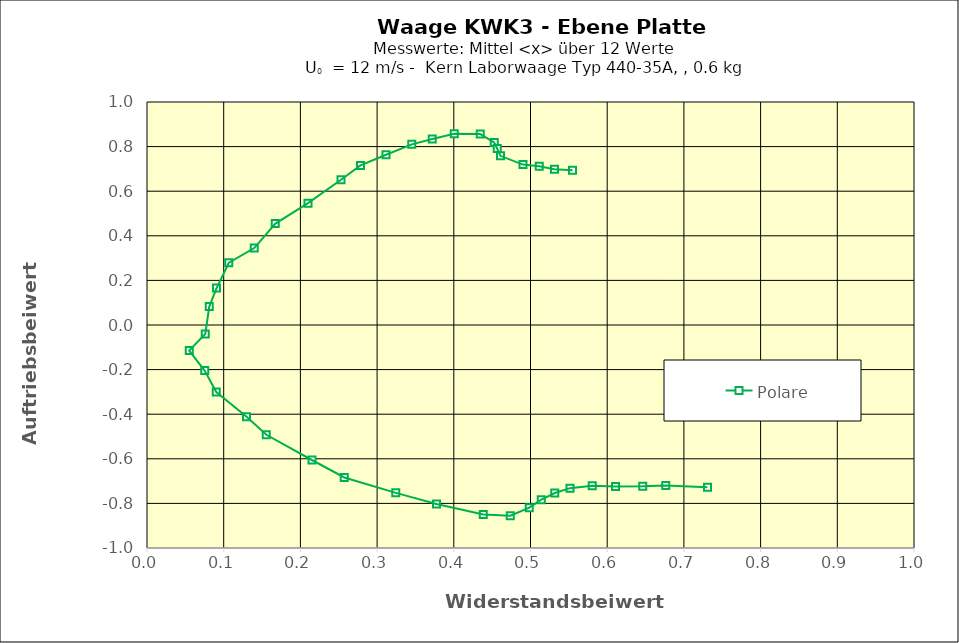
| Category | Polare |
|---|---|
| 0.7306532928645431 | -0.728 |
| 0.6763269576372701 | -0.719 |
| 0.6462316468909177 | -0.723 |
| 0.6109427453757664 | -0.724 |
| 0.5805206855413105 | -0.721 |
| 0.5514041889492324 | -0.732 |
| 0.5317318874913666 | -0.754 |
| 0.5140745387434711 | -0.783 |
| 0.49848373466682494 | -0.819 |
| 0.47375972033367836 | -0.855 |
| 0.4385166783396643 | -0.85 |
| 0.3774203313044981 | -0.803 |
| 0.32446261616116645 | -0.753 |
| 0.2572454561642062 | -0.684 |
| 0.21498017499604288 | -0.605 |
| 0.15559639445334758 | -0.492 |
| 0.12985343888493175 | -0.412 |
| 0.09031679922443815 | -0.301 |
| 0.0751516288283475 | -0.204 |
| 0.05493617866701208 | -0.114 |
| 0.07600289618945864 | -0.04 |
| 0.08118932140807997 | 0.083 |
| 0.09070660515410514 | 0.166 |
| 0.10674310645180442 | 0.279 |
| 0.13987374425343171 | 0.345 |
| 0.16735649540499364 | 0.455 |
| 0.20995282499136675 | 0.546 |
| 0.2528945340963049 | 0.651 |
| 0.2783050081364752 | 0.716 |
| 0.3117093699548908 | 0.764 |
| 0.3452871380876067 | 0.81 |
| 0.37194441785869725 | 0.834 |
| 0.4006195165598289 | 0.857 |
| 0.43446384315915565 | 0.856 |
| 0.45257835400838886 | 0.819 |
| 0.45650364239573454 | 0.792 |
| 0.46074134877082784 | 0.759 |
| 0.4901129389492322 | 0.719 |
| 0.5114218520676851 | 0.711 |
| 0.5311815732377192 | 0.699 |
| 0.5547777299728947 | 0.694 |